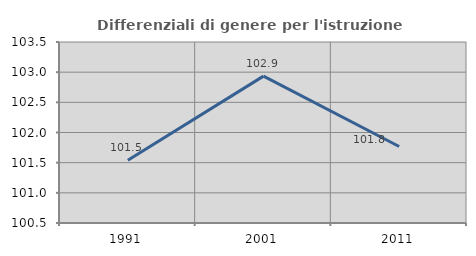
| Category | Differenziali di genere per l'istruzione superiore |
|---|---|
| 1991.0 | 101.541 |
| 2001.0 | 102.934 |
| 2011.0 | 101.768 |